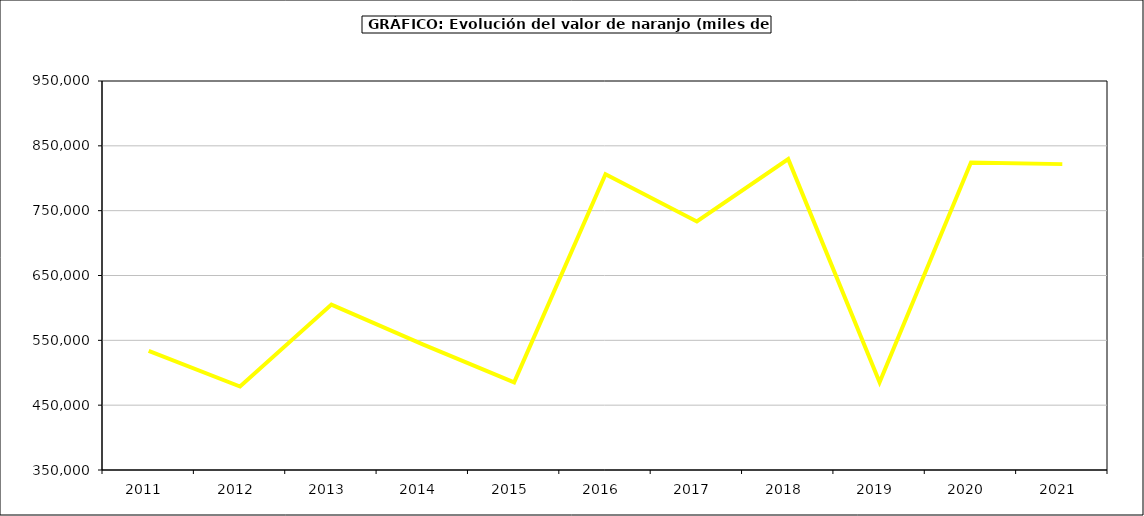
| Category | Valor |
|---|---|
| 2011.0 | 533897.387 |
| 2012.0 | 478708.956 |
| 2013.0 | 605137.07 |
| 2014.0 | 543774.818 |
| 2015.0 | 485218 |
| 2016.0 | 806164 |
| 2017.0 | 733433.06 |
| 2018.0 | 829436.538 |
| 2019.0 | 485336.808 |
| 2020.0 | 824162.074 |
| 2021.0 | 821786.499 |